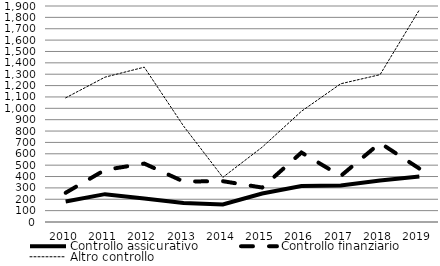
| Category | Controllo assicurativo | Controllo finanziario | Altro controllo |
|---|---|---|---|
| 2010.0 | 180 | 257 | 1092 |
| 2011.0 | 245 | 458 | 1274 |
| 2012.0 | 206 | 514 | 1362 |
| 2013.0 | 168 | 356 | 844 |
| 2014.0 | 154 | 359 | 393 |
| 2015.0 | 251 | 303 | 658 |
| 2016.0 | 316 | 611 | 974 |
| 2017.0 | 321 | 405 | 1216 |
| 2018.0 | 365 | 695 | 1296 |
| 2019.0 | 401 | 470 | 1866 |